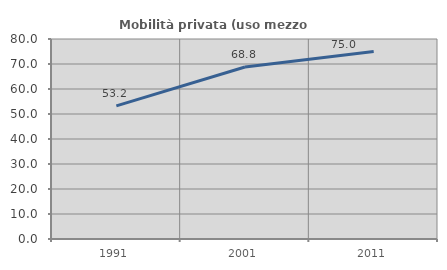
| Category | Mobilità privata (uso mezzo privato) |
|---|---|
| 1991.0 | 53.245 |
| 2001.0 | 68.788 |
| 2011.0 | 75.015 |